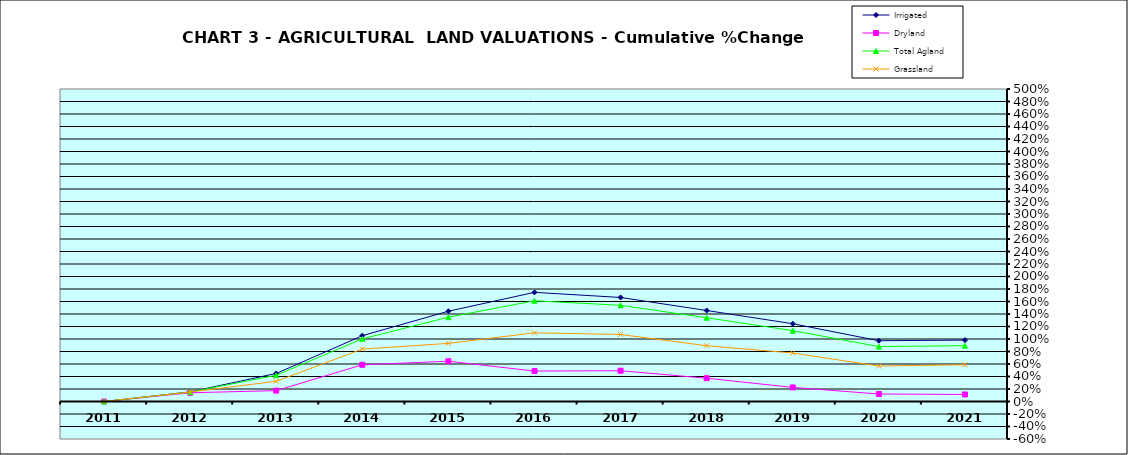
| Category | Irrigated | Dryland | Total Agland | Grassland |
|---|---|---|---|---|
| 2011.0 | 0 | 0 | 0 | 0 |
| 2012.0 | 0.154 | 0.14 | 0.152 | 0.152 |
| 2013.0 | 0.449 | 0.174 | 0.42 | 0.323 |
| 2014.0 | 1.053 | 0.587 | 1.002 | 0.84 |
| 2015.0 | 1.445 | 0.644 | 1.349 | 0.93 |
| 2016.0 | 1.746 | 0.487 | 1.612 | 1.099 |
| 2017.0 | 1.665 | 0.493 | 1.539 | 1.072 |
| 2018.0 | 1.456 | 0.372 | 1.34 | 0.892 |
| 2019.0 | 1.244 | 0.225 | 1.134 | 0.776 |
| 2020.0 | 0.972 | 0.12 | 0.878 | 0.567 |
| 2021.0 | 0.982 | 0.113 | 0.894 | 0.588 |